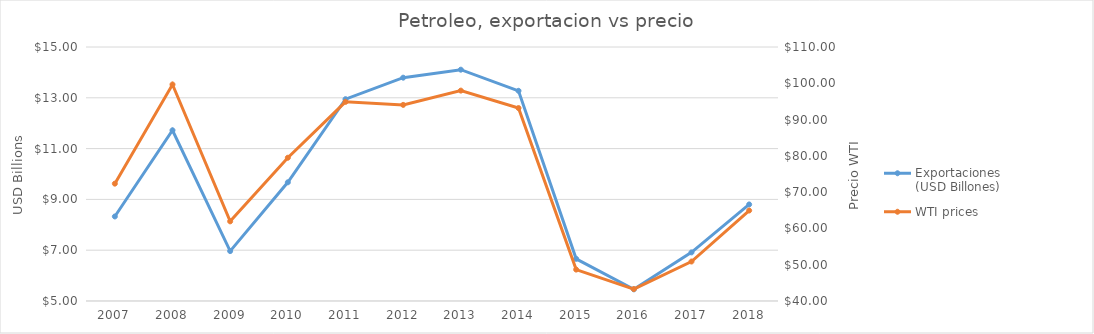
| Category | Exportaciones (USD Billones) |
|---|---|
| 2007.0 | 8.328 |
| 2008.0 | 11.721 |
| 2009.0 | 6.965 |
| 2010.0 | 9.673 |
| 2011.0 | 12.945 |
| 2012.0 | 13.792 |
| 2013.0 | 14.107 |
| 2014.0 | 13.276 |
| 2015.0 | 6.66 |
| 2016.0 | 5.459 |
| 2017.0 | 6.914 |
| 2018.0 | 8.802 |